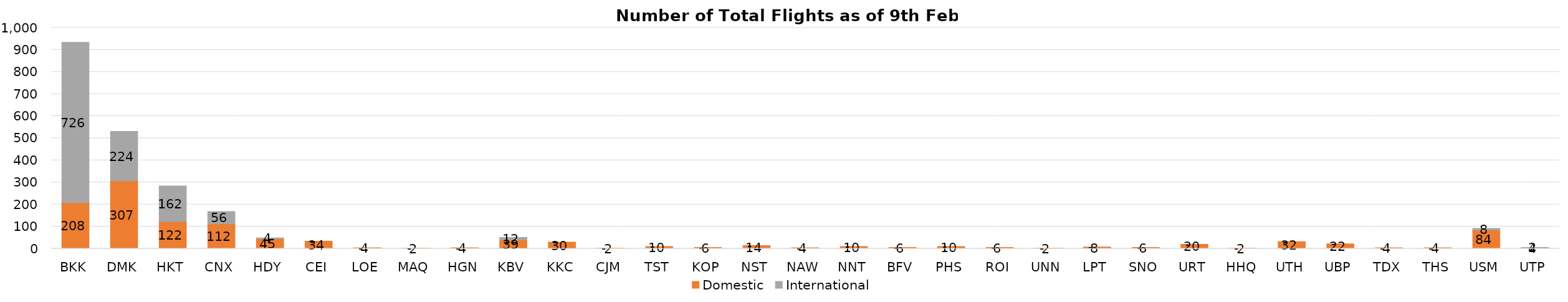
| Category | Domestic | International |
|---|---|---|
| BKK | 208 | 726 |
| DMK | 307 | 224 |
| HKT | 122 | 162 |
| CNX | 112 | 56 |
| HDY | 45 | 4 |
| CEI | 34 | 0 |
| LOE | 4 | 0 |
| MAQ | 2 | 0 |
| HGN | 4 | 0 |
| KBV | 39 | 12 |
| KKC | 30 | 0 |
| CJM | 2 | 0 |
| TST | 10 | 0 |
| KOP | 6 | 0 |
| NST | 14 | 0 |
| NAW | 4 | 0 |
| NNT | 10 | 0 |
| BFV | 6 | 0 |
| PHS | 10 | 0 |
| ROI | 6 | 0 |
| UNN | 2 | 0 |
| LPT | 8 | 0 |
| SNO | 6 | 0 |
| URT | 20 | 0 |
| HHQ | 2 | 0 |
| UTH | 32 | 0 |
| UBP | 22 | 0 |
| TDX | 4 | 0 |
| THS | 4 | 0 |
| USM | 84 | 8 |
| UTP | 4 | 2 |